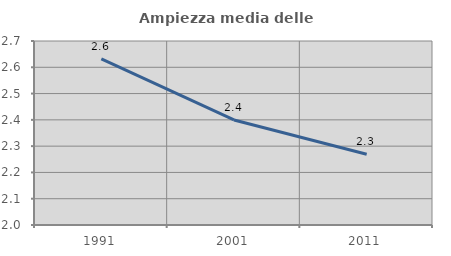
| Category | Ampiezza media delle famiglie |
|---|---|
| 1991.0 | 2.632 |
| 2001.0 | 2.4 |
| 2011.0 | 2.269 |